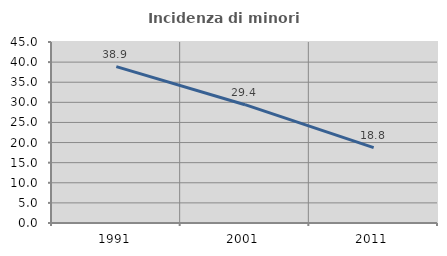
| Category | Incidenza di minori stranieri |
|---|---|
| 1991.0 | 38.889 |
| 2001.0 | 29.412 |
| 2011.0 | 18.75 |